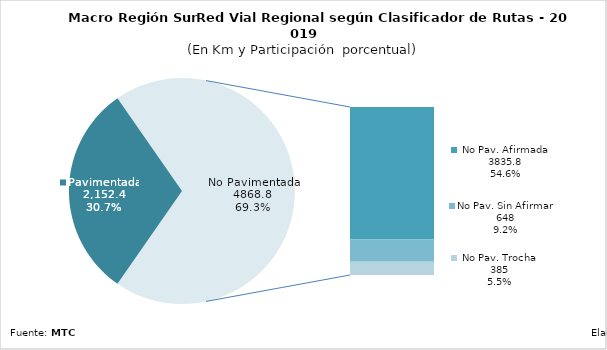
| Category | Series 0 |
|---|---|
| Pavimentada | 2152.39 |
| No Pavimentada                   Afirmada | 3835.798 |
| No Pavimentada                   Sin Afirmar | 648.026 |
| No Pavimentada                            Trocha | 385.009 |